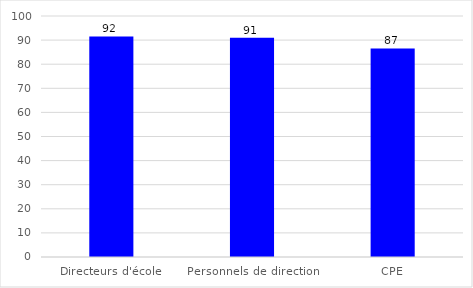
| Category | Series 0 |
|---|---|
| Directeurs d'école | 91.511 |
| Personnels de direction | 91.009 |
| CPE | 86.548 |